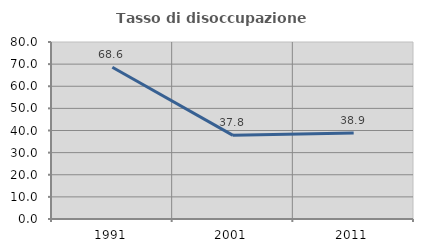
| Category | Tasso di disoccupazione giovanile  |
|---|---|
| 1991.0 | 68.598 |
| 2001.0 | 37.806 |
| 2011.0 | 38.907 |